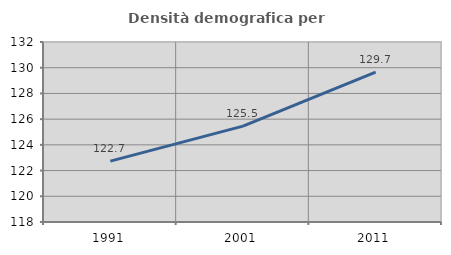
| Category | Densità demografica |
|---|---|
| 1991.0 | 122.737 |
| 2001.0 | 125.454 |
| 2011.0 | 129.659 |